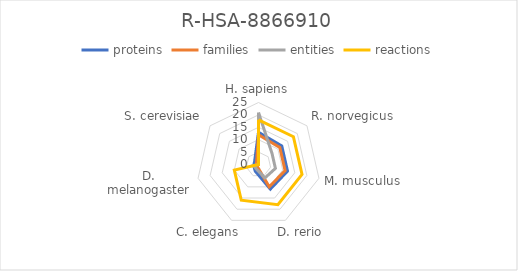
| Category | proteins | families | entities | reactions |
|---|---|---|---|---|
| H. sapiens | 13 | 12 | 21 | 18 |
| R. norvegicus | 12 | 11 | 7 | 18 |
| M. musculus | 12 | 11 | 7 | 18 |
| D. rerio | 11 | 10 | 6 | 18 |
| C. elegans | 3 | 1 | 2 | 16 |
| D. melanogaster | 2 | 1 | 2 | 10 |
| S. cerevisiae | 2 | 1 | 0 | 0 |